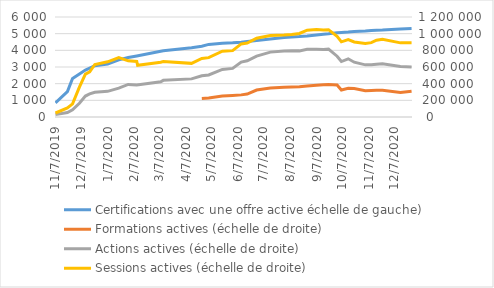
| Category | Certifications avec une offre active échelle de gauche) |
|---|---|
| 11/7/19 | 852 |
| 11/21/19 | 1527 |
| 11/27/19 | 2315 |
| 12/5/19 | 2587 |
| 12/12/19 | 2816 |
| 12/17/19 | 2932 |
| 12/23/19 | 3079 |
| 1/7/20 | 3176 |
| 1/20/20 | 3431 |
| 1/31/20 | 3568 |
| 2/10/20 | 3665 |
| 2/11/20 | 3700 |
| 3/9/20 | 3942 |
| 3/12/20 | 3972 |
| 4/14/20 | 4155 |
| 4/26/20 | 4243 |
| 5/4/20 | 4356 |
| 5/20/20 | 4428 |
| 6/1/20 | 4449 |
| 6/11/20 | 4490 |
| 6/18/20 | 4535 |
| 6/29/20 | 4588 |
| 7/15/20 | 4674 |
| 7/31/20 | 4772 |
| 8/9/20 | 4800 |
| 8/18/20 | 4824 |
| 8/27/20 | 4860 |
| 9/7/20 | 4917 |
| 9/15/20 | 4965 |
| 9/21/20 | 4989 |
| 10/1/20 | 5053 |
| 10/6/20 | 5075 |
| 10/14/20 | 5094 |
| 10/21/20 | 5125 |
| 11/3/20 | 5157 |
| 11/10/20 | 5190 |
| 11/16/20 | 5201 |
| 11/23/20 | 5214 |
| 12/14/20 | 5284 |
| 12/27/20 | 5310 |